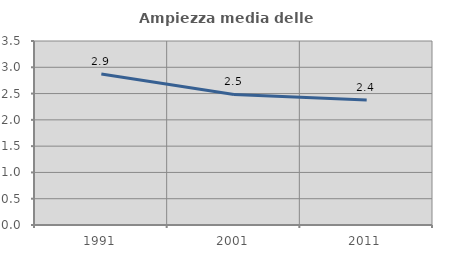
| Category | Ampiezza media delle famiglie |
|---|---|
| 1991.0 | 2.874 |
| 2001.0 | 2.483 |
| 2011.0 | 2.377 |